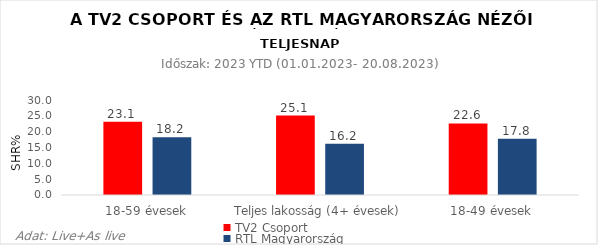
| Category | TV2 Csoport | RTL Magyarország |
|---|---|---|
| 18-59 évesek | 23.1 | 18.2 |
| Teljes lakosság (4+ évesek) | 25.1 | 16.2 |
| 18-49 évesek | 22.6 | 17.8 |